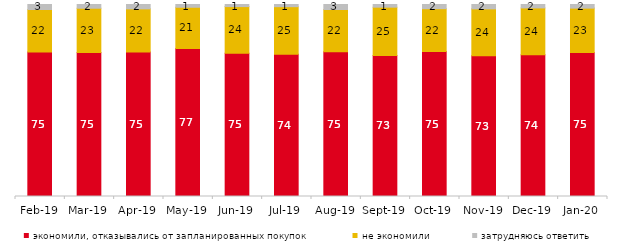
| Category | экономили, отказывались от запланированных покупок | не экономили | затрудняюсь ответить |
|---|---|---|---|
| 2019-02-01 | 75.2 | 22.2 | 2.6 |
| 2019-03-01 | 75.037 | 23.023 | 1.939 |
| 2019-04-01 | 75.297 | 22.426 | 2.277 |
| 2019-05-01 | 77.068 | 21.496 | 1.436 |
| 2019-06-01 | 74.663 | 24.239 | 1.097 |
| 2019-07-01 | 74.109 | 24.752 | 1.139 |
| 2019-08-01 | 75.425 | 21.978 | 2.597 |
| 2019-09-01 | 73.465 | 25.149 | 1.386 |
| 2019-10-01 | 75.495 | 22.327 | 2.178 |
| 2019-11-01 | 73.366 | 24.356 | 2.277 |
| 2019-12-01 | 73.861 | 24.356 | 1.782 |
| 2020-01-01 | 75.05 | 23.069 | 1.881 |